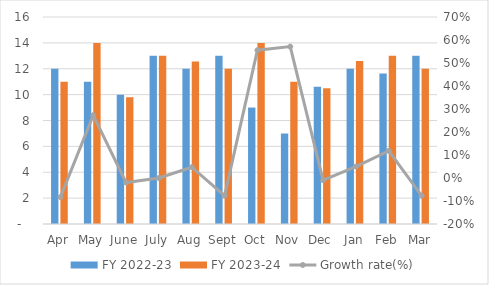
| Category | FY 2022-23 | FY 2023-24 |
|---|---|---|
| Apr | 12 | 11 |
| May | 11 | 14 |
| June | 10 | 9.8 |
| July | 13 | 13 |
| Aug | 12 | 12.563 |
| Sept | 13 | 12 |
| Oct | 9 | 14 |
| Nov | 7 | 11 |
| Dec | 10.6 | 10.5 |
| Jan | 12 | 12.599 |
| Feb | 11.629 | 13 |
| Mar | 13 | 12 |